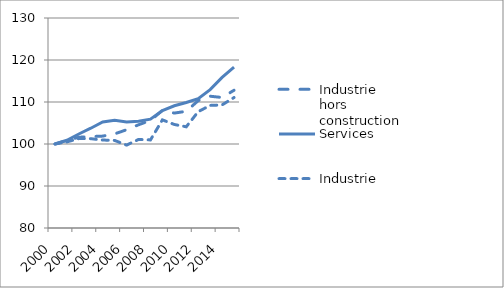
| Category | Industrie hors construction | Services | Industrie |
|---|---|---|---|
| 2000.0 | 100 | 100 | 100 |
| 2001.0 | 100.856 | 100.892 | 100.5 |
| 2002.0 | 101.608 | 102.381 | 101.299 |
| 2003.0 | 101.771 | 103.759 | 101.265 |
| 2004.0 | 101.879 | 105.234 | 100.944 |
| 2005.0 | 102.41 | 105.632 | 100.848 |
| 2006.0 | 103.392 | 105.249 | 99.74 |
| 2007.0 | 104.576 | 105.437 | 101.079 |
| 2008.0 | 105.61 | 105.91 | 100.974 |
| 2009.0 | 107.982 | 107.956 | 105.746 |
| 2010.0 | 107.36 | 109.101 | 104.648 |
| 2011.0 | 107.787 | 109.891 | 104.1 |
| 2012.0 | 110.33 | 110.8 | 107.699 |
| 2013.0 | 111.371 | 112.943 | 109.191 |
| 2014.0 | 111.075 | 115.861 | 109.31 |
| 2015.0 | 112.795 | 118.291 | 111.061 |